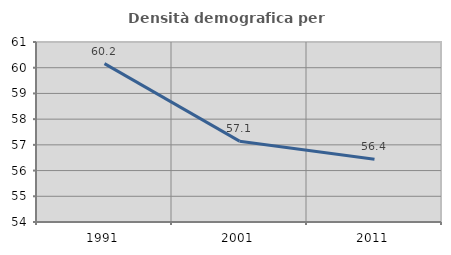
| Category | Densità demografica |
|---|---|
| 1991.0 | 60.16 |
| 2001.0 | 57.144 |
| 2011.0 | 56.442 |